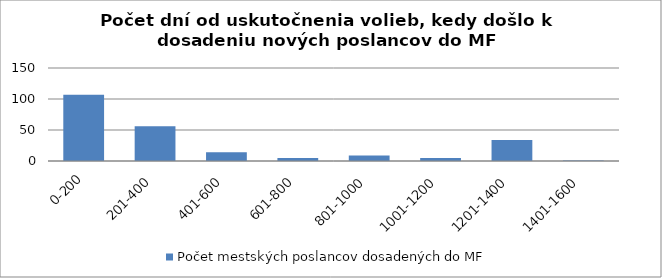
| Category | Počet mestských poslancov dosadených do MF |
|---|---|
| 0-200 | 107 |
| 201-400 | 56 |
| 401-600 | 14 |
| 601-800 | 5 |
| 801-1000 | 9 |
| 1001-1200 | 5 |
| 1201-1400 | 34 |
| 1401-1600 | 1 |